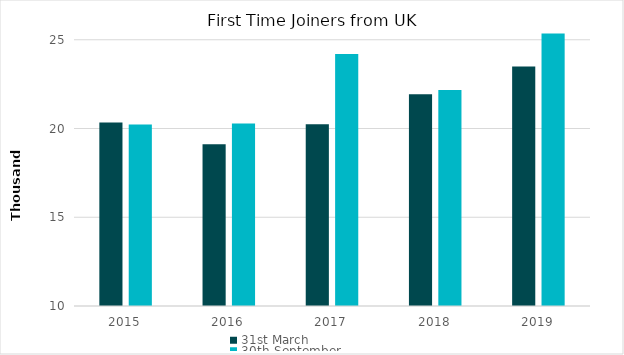
| Category | 31st March | 30th September |
|---|---|---|
| 2015.0 | 20333 | 20231 |
| 2016.0 | 19114 | 20279 |
| 2017.0 | 20240 | 24204 |
| 2018.0 | 21931 | 22170 |
| 2019.0 | 23498 | 25346 |